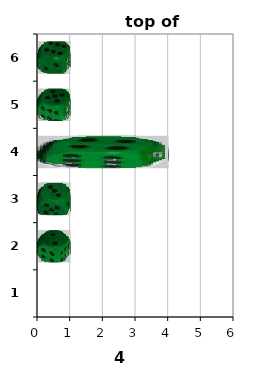
| Category | Series 1 |
|---|---|
| 1.0 | 0 |
| 2.0 | 1 |
| 3.0 | 1 |
| 4.0 | 4 |
| 5.0 | 1 |
| 6.0 | 1 |